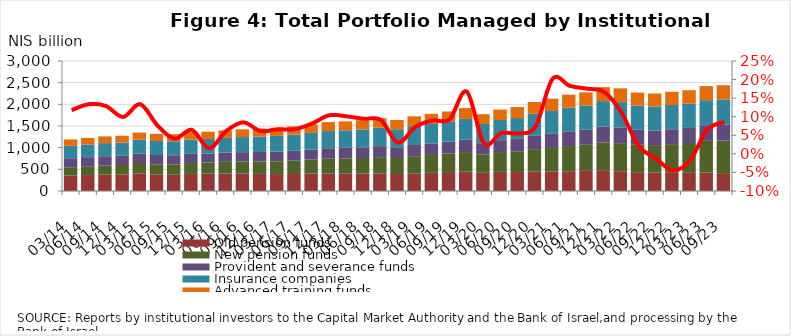
| Category | Old pension funds | New pension funds | Provident and severance funds | Insurance companies | Advanced training funds |
|---|---|---|---|---|---|
| 2014-03-31 | 353841.237 | 194503.566 | 207855.448 | 286937.671 | 147050.79 |
| 2014-06-30 | 367347.109 | 204231.289 | 209018.825 | 293685.099 | 150456.911 |
| 2014-09-30 | 376835.81 | 214231.406 | 212122.612 | 302166.651 | 155186.364 |
| 2014-12-31 | 379149.747 | 220941.602 | 211145.904 | 306088.457 | 157811.406 |
| 2015-03-31 | 407766.852 | 238480.103 | 217541.262 | 320021.053 | 165379.123 |
| 2015-06-30 | 377998.91 | 238584.047 | 213964.644 | 323046.986 | 164673.63 |
| 2015-09-30 | 375003.671 | 240239.995 | 210631.449 | 321958.368 | 164024.895 |
| 2015-12-31 | 394009.261 | 250710.3 | 212571.186 | 330789.846 | 169409.673 |
| 2016-03-31 | 399560.392 | 256138.452 | 210717.212 | 332791.969 | 169965.765 |
| 2016-06-30 | 407029.119 | 266330.142 | 212719.128 | 339548.345 | 173857.09 |
| 2016-09-30 | 404282.94 | 276548.745 | 215975.352 | 347964.478 | 178395.11 |
| 2016-12-31 | 395218.356 | 286472.786 | 219236.832 | 355928.441 | 183799.701 |
| 2017-03-31 | 390378.339 | 295724.533 | 222912.57 | 363011.334 | 187566.428 |
| 2017-06-30 | 391709.081 | 307141.439 | 228329.728 | 372231.012 | 192874.939 |
| 2017-09-30 | 402740.093 | 321661.487 | 233741.441 | 382646.482 | 198731.491 |
| 2017-12-31 | 408397.183 | 337110.231 | 241863.688 | 396293.151 | 206768.207 |
| 2018-03-31 | 408963.351 | 344950.856 | 243400.808 | 402045.85 | 207767.029 |
| 2018-06-30 | 404980.359 | 356723.509 | 247271.377 | 412065.083 | 212149.531 |
| 2018-09-30 | 407549.506 | 373583.03 | 254365.581 | 424811.464 | 219817.214 |
| 2018-12-31 | 392610.35 | 369066.721 | 247165.547 | 415663.942 | 214152.19 |
| 2019-03-31 | 409682.434 | 392949.873 | 259599.347 | 435130.795 | 225972.39 |
| 2019-06-30 | 419699.746 | 412238.813 | 266829.127 | 448024.74 | 233337.284 |
| 2019-09-30 | 436873.365 | 427408.051 | 273305.515 | 458457.617 | 239774.326 |
| 2019-12-31 | 445070.178 | 453159.976 | 283994.45 | 481206.961 | 250173.86 |
| 2020-03-31 | 420264.639 | 424460.557 | 257990.521 | 443809.629 | 225647.442 |
| 2020-06-30 | 441583.014 | 456963.565 | 274382.869 | 464715.564 | 242032.798 |
| 2020-09-30 | 437471.661 | 480207.453 | 285869.533 | 479529.895 | 253459.669 |
| 2020-12-31 | 444730.312 | 521341.893 | 307058.721 | 508635.702 | 272631.199 |
| 2021-03-31 | 445846.383 | 549551.75 | 323387.197 | 527059.137 | 284834.843 |
| 2021-06-30 | 455642.782 | 581354.211 | 340022.339 | 547917.213 | 298732.086 |
| 2021-09-30 | 464891.868 | 601622.772 | 346161.906 | 559765.909 | 303953.763 |
| 2021-12-31 | 481035.907 | 640332.283 | 367096.291 | 586510.775 | 321477.273 |
| 2022-03-31 | 456364.834 | 647866.377 | 364714.734 | 582900.247 | 317423.711 |
| 2022-06-30 | 435454.051 | 632258.662 | 344442.779 | 560247.736 | 299535.625 |
| 2022-09-30 | 422096.78 | 637197.331 | 338973.173 | 553689.087 | 296831.372 |
| 2022-12-31 | 418242.028 | 663252.805 | 344241.884 | 560064.527 | 304118.618 |
| 2023-03-31 | 419238.201 | 688496.181 | 347290.177 | 562771.855 | 308995.303 |
| 2023-06-30 | 424281.593 | 732625.871 | 361541.166 | 577640.063 | 324662.57 |
| 2023-09-30 | 412695.235 | 755112.415 | 365402.219 | 577636.283 | 330381.458 |